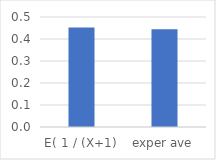
| Category | Series 0 |
|---|---|
| E( 1 / (X+1) | 0.453 |
| exper ave | 0.445 |